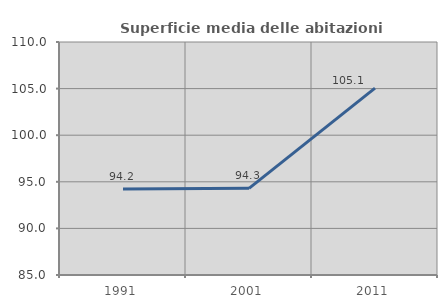
| Category | Superficie media delle abitazioni occupate |
|---|---|
| 1991.0 | 94.227 |
| 2001.0 | 94.301 |
| 2011.0 | 105.057 |